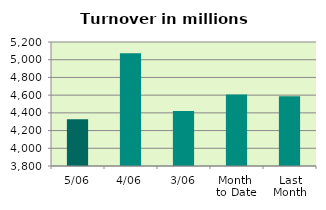
| Category | Series 0 |
|---|---|
| 5/06 | 4326.755 |
| 4/06 | 5073.438 |
| 3/06 | 4420.474 |
| Month 
to Date | 4606.889 |
| Last
Month | 4586.899 |